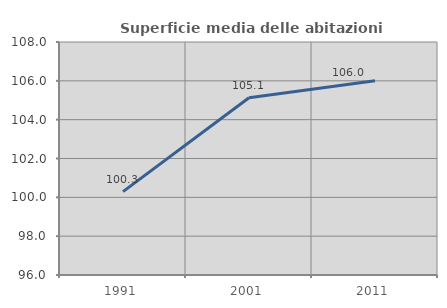
| Category | Superficie media delle abitazioni occupate |
|---|---|
| 1991.0 | 100.295 |
| 2001.0 | 105.128 |
| 2011.0 | 106.01 |